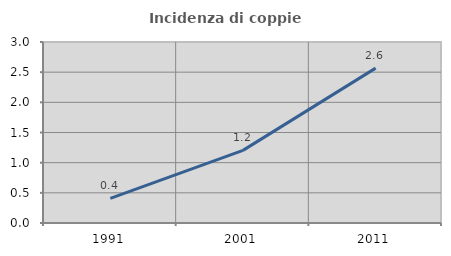
| Category | Incidenza di coppie miste |
|---|---|
| 1991.0 | 0.409 |
| 2001.0 | 1.204 |
| 2011.0 | 2.567 |